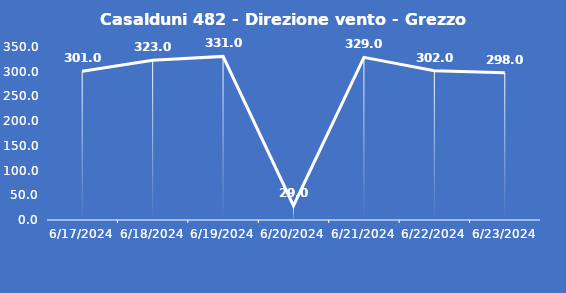
| Category | Casalduni 482 - Direzione vento - Grezzo (°N) |
|---|---|
| 6/17/24 | 301 |
| 6/18/24 | 323 |
| 6/19/24 | 331 |
| 6/20/24 | 29 |
| 6/21/24 | 329 |
| 6/22/24 | 302 |
| 6/23/24 | 298 |